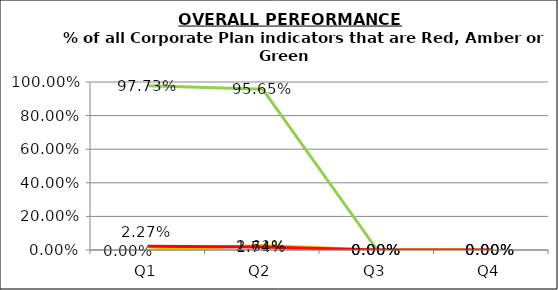
| Category | Green | Amber | Red |
|---|---|---|---|
| Q1 | 0.977 | 0 | 0.023 |
| Q2 | 0.957 | 0.026 | 0.017 |
| Q3 | 0 | 0 | 0 |
| Q4 | 0 | 0 | 0 |